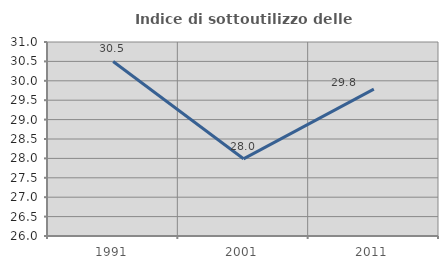
| Category | Indice di sottoutilizzo delle abitazioni  |
|---|---|
| 1991.0 | 30.499 |
| 2001.0 | 27.989 |
| 2011.0 | 29.787 |